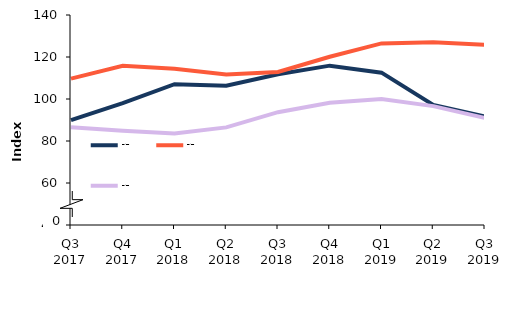
| Category | Series 1 | Series 2 | Series 3 |
|---|---|---|---|
| Q3 2017 | 89.931 | 109.676 | 86.598 |
| Q4 2017 | 98.058 | 115.835 | 84.869 |
| Q1 2018 | 107.067 | 114.41 | 83.576 |
| Q2 2018 | 106.285 | 111.716 | 86.482 |
| Q3 2018 | 111.753 | 112.91 | 93.715 |
| Q4 2018 | 115.88 | 120.12 | 98.238 |
| Q1 2019 | 112.542 | 126.475 | 100.037 |
| Q2 2019 | 97.169 | 127.047 | 96.602 |
| Q3 2019 | 91.682 | 125.784 | 90.936 |